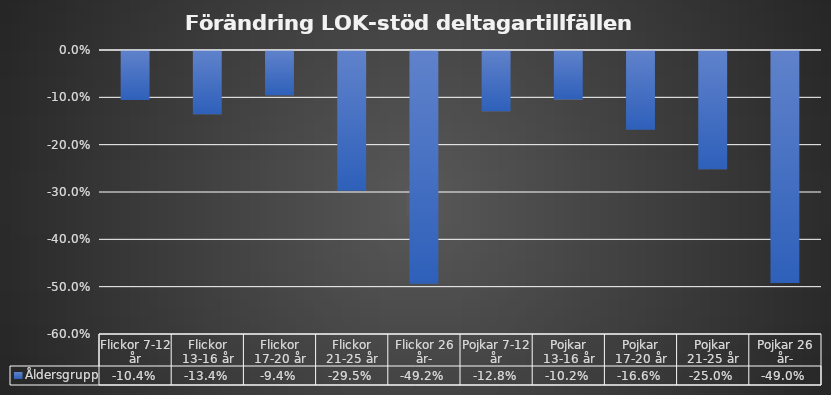
| Category | Åldersgrupp |
|---|---|
| Flickor 7-12 år | -0.104 |
| Flickor 13-16 år | -0.134 |
| Flickor 17-20 år | -0.094 |
| Flickor 21-25 år | -0.295 |
| Flickor 26 år- | -0.492 |
| Pojkar 7-12 år | -0.128 |
| Pojkar 13-16 år | -0.102 |
| Pojkar 17-20 år | -0.166 |
| Pojkar 21-25 år | -0.25 |
| Pojkar 26 år- | -0.49 |